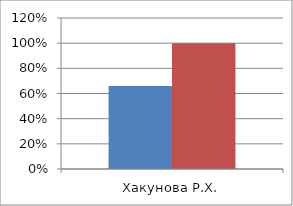
| Category | Series 0 | 2 |
|---|---|---|
| Хакунова Р.Х. | 0.659 | 1 |